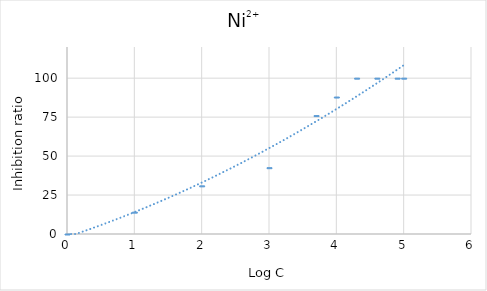
| Category | Ni2+ |
|---|---|
| 0.0 | 0 |
| 1.0 | 14.025 |
| 2.0 | 30.901 |
| 3.0 | 42.556 |
| 3.6989700043360187 | 75.986 |
| 4.0 | 87.892 |
| 4.301029995663981 | 100 |
| 4.6020599913279625 | 100 |
| 4.903089986991944 | 100 |
| 5.0 | 100 |